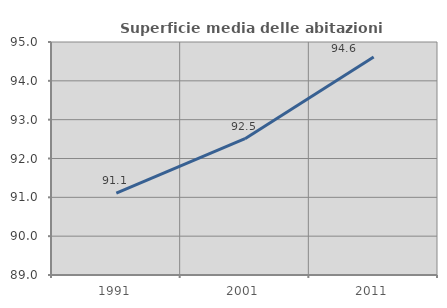
| Category | Superficie media delle abitazioni occupate |
|---|---|
| 1991.0 | 91.11 |
| 2001.0 | 92.51 |
| 2011.0 | 94.615 |